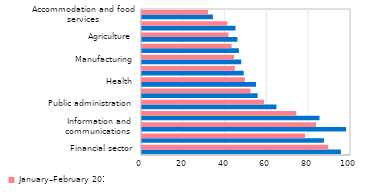
| Category | January–February 2019 | January–February 2018 |
|---|---|---|
| Financial sector | 95.178 | 89.072 |
| Energy | 87.045 | 77.996 |
| Information and communications  | 97.64 | 83.283 |
| Mining | 84.928 | 73.782 |
| Public administration | 64.33 | 58.398 |
| Education | 55.33 | 51.884 |
| Health | 54.529 | 49.209 |
| Transport and storage  | 48.644 | 44.438 |
| Manufacturing | 47.488 | 44.04 |
| Construction | 46.364 | 42.896 |
| Agriculture | 45.657 | 41.374 |
| Trade | 44.744 | 40.738 |
| Accommodation and food services | 33.906 | 31.642 |